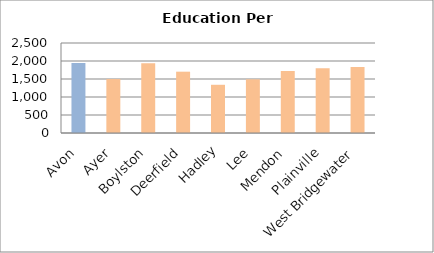
| Category | Series 0 |
|---|---|
| Avon | 1943.404 |
| Ayer | 1498.563 |
| Boylston | 1937.731 |
| Deerfield | 1703.269 |
| Hadley | 1339.217 |
| Lee | 1491.587 |
| Mendon | 1722.124 |
| Plainville | 1801.229 |
| West Bridgewater | 1829.997 |